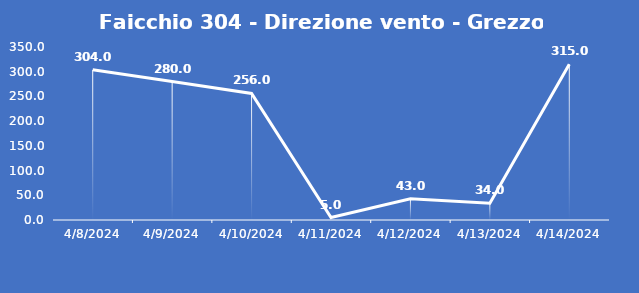
| Category | Faicchio 304 - Direzione vento - Grezzo (°N) |
|---|---|
| 4/8/24 | 304 |
| 4/9/24 | 280 |
| 4/10/24 | 256 |
| 4/11/24 | 5 |
| 4/12/24 | 43 |
| 4/13/24 | 34 |
| 4/14/24 | 315 |